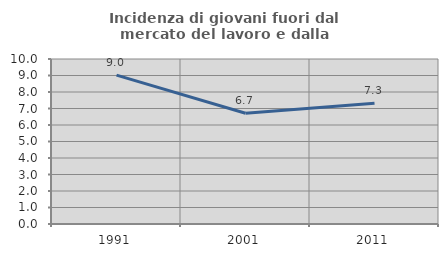
| Category | Incidenza di giovani fuori dal mercato del lavoro e dalla formazione  |
|---|---|
| 1991.0 | 9.025 |
| 2001.0 | 6.714 |
| 2011.0 | 7.317 |